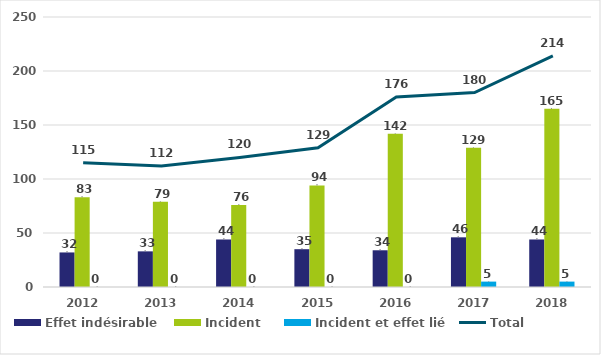
| Category | Effet indésirable | Incident | Incident et effet lié |
|---|---|---|---|
| 2012.0 | 32 | 83 | 0 |
| 2013.0 | 33 | 79 | 0 |
| 2014.0 | 44 | 76 | 0 |
| 2015.0 | 35 | 94 | 0 |
| 2016.0 | 34 | 142 | 0 |
| 2017.0 | 46 | 129 | 5 |
| 2018.0 | 44 | 165 | 5 |